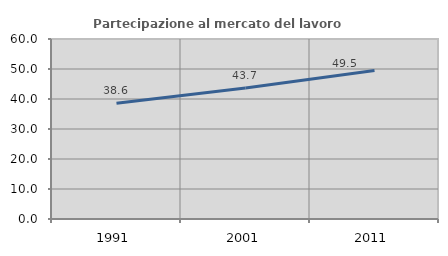
| Category | Partecipazione al mercato del lavoro  femminile |
|---|---|
| 1991.0 | 38.584 |
| 2001.0 | 43.68 |
| 2011.0 | 49.513 |